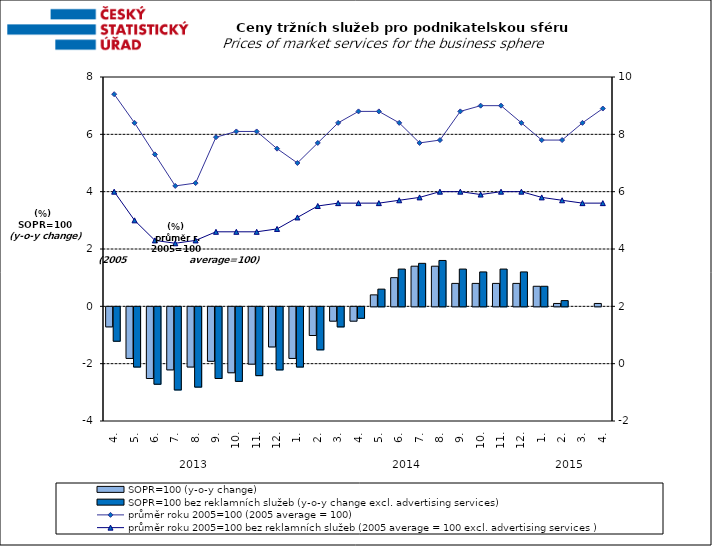
| Category | SOPR=100 (y-o-y change)   | SOPR=100 bez reklamních služeb (y-o-y change excl. advertising services)   |
|---|---|---|
| 0 | -0.7 | -1.2 |
| 1 | -1.8 | -2.1 |
| 2 | -2.5 | -2.7 |
| 3 | -2.2 | -2.9 |
| 4 | -2.1 | -2.8 |
| 5 | -1.9 | -2.5 |
| 6 | -2.3 | -2.6 |
| 7 | -2 | -2.4 |
| 8 | -1.4 | -2.2 |
| 9 | -1.8 | -2.1 |
| 10 | -1 | -1.5 |
| 11 | -0.5 | -0.7 |
| 12 | -0.5 | -0.4 |
| 13 | 0.4 | 0.6 |
| 14 | 1 | 1.3 |
| 15 | 1.4 | 1.5 |
| 16 | 1.4 | 1.6 |
| 17 | 0.8 | 1.3 |
| 18 | 0.8 | 1.2 |
| 19 | 0.8 | 1.3 |
| 20 | 0.8 | 1.2 |
| 21 | 0.7 | 0.7 |
| 22 | 0.1 | 0.2 |
| 23 | 0 | 0 |
| 24 | 0.1 | 0 |